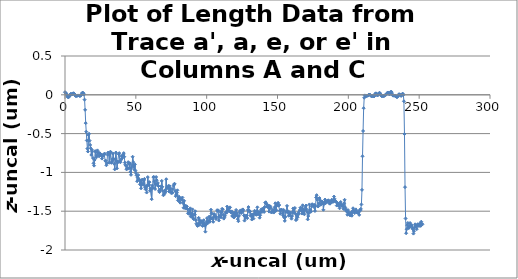
| Category | z-uncal    um |
|---|---|
| 0.0 | 0.034 |
| 0.394775 | 0.026 |
| 0.789549 | 0.017 |
| 1.18432 | 0.004 |
| 1.5791 | -0.015 |
| 1.97387 | -0.028 |
| 2.36865 | -0.033 |
| 2.76342 | -0.025 |
| 3.1582 | -0.017 |
| 3.55297 | -0.001 |
| 3.94775 | 0.01 |
| 4.34252 | 0.013 |
| 4.7373 | 0.005 |
| 5.13207 | 0.005 |
| 5.52685 | 0.013 |
| 5.92162 | 0.021 |
| 6.31639 | 0.017 |
| 6.71117 | 0.01 |
| 7.10594 | -0.008 |
| 7.50072 | -0.015 |
| 7.89549 | -0.015 |
| 8.29027 | -0.013 |
| 8.68504 | -0.013 |
| 9.07982 | -0.008 |
| 9.47459 | -0.009 |
| 9.86937 | -0.008 |
| 10.2641 | -0.014 |
| 10.6589 | -0.016 |
| 11.0537 | -0.01 |
| 11.4485 | -0.002 |
| 11.8432 | 0.011 |
| 12.238 | 0.027 |
| 12.6328 | 0.028 |
| 13.0276 | 0.016 |
| 13.4223 | 0.003 |
| 13.8171 | -0.062 |
| 14.2119 | -0.194 |
| 14.6067 | -0.365 |
| 15.0014 | -0.476 |
| 15.3962 | -0.588 |
| 15.791 | -0.693 |
| 16.1858 | -0.731 |
| 16.5805 | -0.517 |
| 16.9753 | -0.502 |
| 17.3701 | -0.59 |
| 17.7649 | -0.646 |
| 18.1596 | -0.689 |
| 18.5544 | -0.776 |
| 18.9492 | -0.709 |
| 19.344 | -0.731 |
| 19.7387 | -0.815 |
| 20.1335 | -0.883 |
| 20.5283 | -0.913 |
| 20.9231 | -0.839 |
| 21.3178 | -0.726 |
| 21.7126 | -0.734 |
| 22.1074 | -0.807 |
| 22.5022 | -0.786 |
| 22.8969 | -0.716 |
| 23.2917 | -0.762 |
| 23.6865 | -0.745 |
| 24.0813 | -0.792 |
| 24.476 | -0.751 |
| 24.8708 | -0.761 |
| 25.2656 | -0.783 |
| 25.6604 | -0.772 |
| 26.0551 | -0.822 |
| 26.4499 | -0.796 |
| 26.8447 | -0.778 |
| 27.2395 | -0.779 |
| 27.6342 | -0.764 |
| 28.029 | -0.758 |
| 28.4238 | -0.851 |
| 28.8185 | -0.849 |
| 29.2133 | -0.908 |
| 29.6081 | -0.88 |
| 30.0029 | -0.771 |
| 30.3976 | -0.744 |
| 30.7924 | -0.762 |
| 31.1872 | -0.875 |
| 31.582 | -0.765 |
| 31.9767 | -0.733 |
| 32.3715 | -0.741 |
| 32.7663 | -0.877 |
| 33.1611 | -0.861 |
| 33.5558 | -0.829 |
| 33.9506 | -0.758 |
| 34.3454 | -0.832 |
| 34.7402 | -0.889 |
| 35.1349 | -0.961 |
| 35.5297 | -0.826 |
| 35.9245 | -0.744 |
| 36.3193 | -0.853 |
| 36.714 | -0.948 |
| 37.1088 | -0.872 |
| 37.5036 | -0.862 |
| 37.8984 | -0.766 |
| 38.2931 | -0.752 |
| 38.6879 | -0.861 |
| 39.0827 | -0.87 |
| 39.4775 | -0.839 |
| 39.8722 | -0.792 |
| 40.267 | -0.82 |
| 40.6618 | -0.789 |
| 41.0566 | -0.771 |
| 41.4513 | -0.751 |
| 41.8461 | -0.798 |
| 42.2409 | -0.873 |
| 42.6357 | -0.9 |
| 43.0304 | -0.914 |
| 43.4252 | -0.96 |
| 43.82 | -0.944 |
| 44.2148 | -0.952 |
| 44.6095 | -0.868 |
| 45.0043 | -0.886 |
| 45.3991 | -0.944 |
| 45.7939 | -0.883 |
| 46.1886 | -0.994 |
| 46.5834 | -1.031 |
| 46.9782 | -0.939 |
| 47.373 | -0.904 |
| 47.7677 | -0.798 |
| 48.1625 | -0.868 |
| 48.5573 | -0.926 |
| 48.9521 | -0.963 |
| 49.3468 | -0.896 |
| 49.7416 | -0.978 |
| 50.1364 | -1.009 |
| 50.5312 | -1.038 |
| 50.9259 | -1.114 |
| 51.3207 | -1.067 |
| 51.7155 | -1.034 |
| 52.1103 | -1.092 |
| 52.505 | -1.1 |
| 52.8998 | -1.154 |
| 53.2946 | -1.102 |
| 53.6894 | -1.205 |
| 54.0841 | -1.102 |
| 54.4789 | -1.093 |
| 54.8737 | -1.158 |
| 55.2685 | -1.149 |
| 55.6632 | -1.101 |
| 56.058 | -1.083 |
| 56.4528 | -1.189 |
| 56.8475 | -1.218 |
| 57.2423 | -1.176 |
| 57.6371 | -1.26 |
| 58.0319 | -1.173 |
| 58.4266 | -1.06 |
| 58.8214 | -1.161 |
| 59.2162 | -1.157 |
| 59.611 | -1.125 |
| 60.0057 | -1.237 |
| 60.4005 | -1.209 |
| 60.7953 | -1.22 |
| 61.1901 | -1.346 |
| 61.5848 | -1.169 |
| 61.9796 | -1.198 |
| 62.3744 | -1.06 |
| 62.7692 | -1.06 |
| 63.1639 | -1.116 |
| 63.5587 | -1.214 |
| 63.9535 | -1.151 |
| 64.3483 | -1.059 |
| 64.743 | -1.1 |
| 65.1378 | -1.164 |
| 65.5326 | -1.136 |
| 65.9274 | -1.176 |
| 66.3221 | -1.238 |
| 66.7169 | -1.254 |
| 67.1117 | -1.235 |
| 67.5065 | -1.214 |
| 67.9012 | -1.181 |
| 68.296 | -1.11 |
| 68.6908 | -1.185 |
| 69.0856 | -1.24 |
| 69.4803 | -1.295 |
| 69.8751 | -1.281 |
| 70.2699 | -1.27 |
| 70.6647 | -1.232 |
| 71.0594 | -1.249 |
| 71.4542 | -1.088 |
| 71.849 | -1.205 |
| 72.2438 | -1.196 |
| 72.6385 | -1.2 |
| 73.0333 | -1.173 |
| 73.4281 | -1.246 |
| 73.8229 | -1.177 |
| 74.2176 | -1.241 |
| 74.6124 | -1.208 |
| 75.0072 | -1.267 |
| 75.402 | -1.255 |
| 75.7967 | -1.264 |
| 76.1915 | -1.214 |
| 76.5863 | -1.172 |
| 76.9811 | -1.153 |
| 77.3758 | -1.147 |
| 77.7706 | -1.239 |
| 78.1654 | -1.307 |
| 78.5602 | -1.289 |
| 78.9549 | -1.261 |
| 79.3497 | -1.231 |
| 79.7445 | -1.361 |
| 80.1393 | -1.333 |
| 80.534 | -1.313 |
| 80.9288 | -1.379 |
| 81.3236 | -1.391 |
| 81.7184 | -1.339 |
| 82.1131 | -1.342 |
| 82.5079 | -1.35 |
| 82.9027 | -1.323 |
| 83.2975 | -1.394 |
| 83.6922 | -1.456 |
| 84.087 | -1.366 |
| 84.4818 | -1.455 |
| 84.8766 | -1.461 |
| 85.2713 | -1.429 |
| 85.6661 | -1.463 |
| 86.0609 | -1.439 |
| 86.4556 | -1.472 |
| 86.8504 | -1.528 |
| 87.2452 | -1.522 |
| 87.64 | -1.536 |
| 88.0347 | -1.488 |
| 88.4295 | -1.463 |
| 88.8243 | -1.57 |
| 89.2191 | -1.531 |
| 89.6138 | -1.558 |
| 90.0086 | -1.476 |
| 90.4034 | -1.589 |
| 90.7982 | -1.602 |
| 91.1929 | -1.544 |
| 91.5877 | -1.542 |
| 91.9825 | -1.501 |
| 92.3773 | -1.617 |
| 92.772 | -1.66 |
| 93.1668 | -1.676 |
| 93.5616 | -1.69 |
| 93.9564 | -1.662 |
| 94.3511 | -1.586 |
| 94.7459 | -1.605 |
| 95.1407 | -1.676 |
| 95.5355 | -1.643 |
| 95.9302 | -1.634 |
| 96.325 | -1.628 |
| 96.7198 | -1.644 |
| 97.1146 | -1.69 |
| 97.5093 | -1.665 |
| 97.9041 | -1.616 |
| 98.2989 | -1.661 |
| 98.6937 | -1.685 |
| 99.0884 | -1.764 |
| 99.4832 | -1.674 |
| 99.878 | -1.637 |
| 100.273 | -1.589 |
| 100.668 | -1.657 |
| 101.062 | -1.638 |
| 101.457 | -1.629 |
| 101.852 | -1.569 |
| 102.247 | -1.636 |
| 102.641 | -1.587 |
| 103.036 | -1.481 |
| 103.431 | -1.526 |
| 103.826 | -1.596 |
| 104.221 | -1.589 |
| 104.615 | -1.637 |
| 105.01 | -1.539 |
| 105.405 | -1.538 |
| 105.8 | -1.573 |
| 106.194 | -1.568 |
| 106.589 | -1.601 |
| 106.984 | -1.582 |
| 107.379 | -1.487 |
| 107.773 | -1.497 |
| 108.168 | -1.489 |
| 108.563 | -1.62 |
| 108.958 | -1.57 |
| 109.353 | -1.563 |
| 109.747 | -1.508 |
| 110.142 | -1.579 |
| 110.537 | -1.51 |
| 110.932 | -1.469 |
| 111.326 | -1.477 |
| 111.721 | -1.551 |
| 112.116 | -1.596 |
| 112.511 | -1.578 |
| 112.906 | -1.559 |
| 113.3 | -1.526 |
| 113.695 | -1.51 |
| 114.09 | -1.519 |
| 114.485 | -1.44 |
| 114.879 | -1.472 |
| 115.274 | -1.49 |
| 115.669 | -1.497 |
| 116.064 | -1.457 |
| 116.459 | -1.45 |
| 116.853 | -1.509 |
| 117.248 | -1.517 |
| 117.643 | -1.502 |
| 118.038 | -1.56 |
| 118.432 | -1.567 |
| 118.827 | -1.526 |
| 119.222 | -1.581 |
| 119.617 | -1.518 |
| 120.011 | -1.562 |
| 120.406 | -1.552 |
| 120.801 | -1.483 |
| 121.196 | -1.521 |
| 121.591 | -1.558 |
| 121.985 | -1.602 |
| 122.38 | -1.629 |
| 122.775 | -1.56 |
| 123.17 | -1.518 |
| 123.564 | -1.498 |
| 123.959 | -1.49 |
| 124.354 | -1.525 |
| 124.749 | -1.51 |
| 125.144 | -1.483 |
| 125.538 | -1.477 |
| 125.933 | -1.49 |
| 126.328 | -1.555 |
| 126.723 | -1.621 |
| 127.117 | -1.567 |
| 127.512 | -1.589 |
| 127.907 | -1.556 |
| 128.302 | -1.558 |
| 128.697 | -1.59 |
| 129.091 | -1.484 |
| 129.486 | -1.447 |
| 129.881 | -1.488 |
| 130.276 | -1.508 |
| 130.67 | -1.504 |
| 131.065 | -1.56 |
| 131.46 | -1.542 |
| 131.855 | -1.607 |
| 132.25 | -1.572 |
| 132.644 | -1.542 |
| 133.039 | -1.596 |
| 133.434 | -1.538 |
| 133.829 | -1.494 |
| 134.223 | -1.514 |
| 134.618 | -1.534 |
| 135.013 | -1.546 |
| 135.408 | -1.496 |
| 135.802 | -1.45 |
| 136.197 | -1.54 |
| 136.592 | -1.531 |
| 136.987 | -1.508 |
| 137.382 | -1.584 |
| 137.776 | -1.552 |
| 138.171 | -1.508 |
| 138.566 | -1.478 |
| 138.961 | -1.512 |
| 139.355 | -1.467 |
| 139.75 | -1.49 |
| 140.145 | -1.469 |
| 140.54 | -1.51 |
| 140.935 | -1.446 |
| 141.329 | -1.391 |
| 141.724 | -1.385 |
| 142.119 | -1.405 |
| 142.514 | -1.439 |
| 142.908 | -1.42 |
| 143.303 | -1.45 |
| 143.698 | -1.442 |
| 144.093 | -1.505 |
| 144.488 | -1.431 |
| 144.882 | -1.44 |
| 145.277 | -1.46 |
| 145.672 | -1.516 |
| 146.067 | -1.509 |
| 146.461 | -1.499 |
| 146.856 | -1.481 |
| 147.251 | -1.518 |
| 147.646 | -1.511 |
| 148.04 | -1.448 |
| 148.435 | -1.397 |
| 148.83 | -1.494 |
| 149.225 | -1.489 |
| 149.62 | -1.426 |
| 150.014 | -1.407 |
| 150.409 | -1.391 |
| 150.804 | -1.428 |
| 151.199 | -1.42 |
| 151.593 | -1.492 |
| 151.988 | -1.533 |
| 152.383 | -1.482 |
| 152.778 | -1.483 |
| 153.173 | -1.484 |
| 153.567 | -1.526 |
| 153.962 | -1.556 |
| 154.357 | -1.484 |
| 154.752 | -1.581 |
| 155.146 | -1.625 |
| 155.541 | -1.573 |
| 155.936 | -1.512 |
| 156.331 | -1.503 |
| 156.726 | -1.431 |
| 157.12 | -1.512 |
| 157.515 | -1.502 |
| 157.91 | -1.559 |
| 158.305 | -1.537 |
| 158.699 | -1.513 |
| 159.094 | -1.525 |
| 159.489 | -1.564 |
| 159.884 | -1.597 |
| 160.279 | -1.563 |
| 160.673 | -1.505 |
| 161.068 | -1.464 |
| 161.463 | -1.522 |
| 161.858 | -1.467 |
| 162.252 | -1.458 |
| 162.647 | -1.531 |
| 163.042 | -1.615 |
| 163.437 | -1.605 |
| 163.831 | -1.548 |
| 164.226 | -1.577 |
| 164.621 | -1.528 |
| 165.016 | -1.537 |
| 165.411 | -1.502 |
| 165.805 | -1.484 |
| 166.2 | -1.455 |
| 166.595 | -1.457 |
| 166.99 | -1.491 |
| 167.384 | -1.531 |
| 167.779 | -1.424 |
| 168.174 | -1.528 |
| 168.569 | -1.479 |
| 168.964 | -1.541 |
| 169.358 | -1.483 |
| 169.753 | -1.444 |
| 170.148 | -1.427 |
| 170.543 | -1.476 |
| 170.937 | -1.51 |
| 171.332 | -1.606 |
| 171.727 | -1.562 |
| 172.122 | -1.527 |
| 172.517 | -1.413 |
| 172.911 | -1.486 |
| 173.306 | -1.486 |
| 173.701 | -1.505 |
| 174.096 | -1.436 |
| 174.49 | -1.41 |
| 174.885 | -1.419 |
| 175.28 | -1.424 |
| 175.675 | -1.445 |
| 176.069 | -1.419 |
| 176.464 | -1.497 |
| 176.859 | -1.428 |
| 177.254 | -1.322 |
| 177.649 | -1.293 |
| 178.043 | -1.352 |
| 178.438 | -1.44 |
| 178.833 | -1.436 |
| 179.228 | -1.399 |
| 179.622 | -1.331 |
| 180.017 | -1.358 |
| 180.412 | -1.416 |
| 180.807 | -1.406 |
| 181.202 | -1.379 |
| 181.596 | -1.376 |
| 181.991 | -1.397 |
| 182.386 | -1.482 |
| 182.781 | -1.408 |
| 183.175 | -1.388 |
| 183.57 | -1.35 |
| 183.965 | -1.397 |
| 184.36 | -1.373 |
| 184.755 | -1.377 |
| 185.149 | -1.377 |
| 185.544 | -1.366 |
| 185.939 | -1.359 |
| 186.334 | -1.374 |
| 186.728 | -1.402 |
| 187.123 | -1.403 |
| 187.518 | -1.377 |
| 187.913 | -1.383 |
| 188.308 | -1.352 |
| 188.702 | -1.368 |
| 189.097 | -1.381 |
| 189.492 | -1.373 |
| 189.887 | -1.311 |
| 190.281 | -1.341 |
| 190.676 | -1.373 |
| 191.071 | -1.373 |
| 191.466 | -1.383 |
| 191.86 | -1.428 |
| 192.255 | -1.393 |
| 192.65 | -1.404 |
| 193.045 | -1.42 |
| 193.44 | -1.428 |
| 193.834 | -1.463 |
| 194.229 | -1.404 |
| 194.624 | -1.381 |
| 195.019 | -1.423 |
| 195.413 | -1.432 |
| 195.808 | -1.433 |
| 196.203 | -1.42 |
| 196.598 | -1.47 |
| 196.993 | -1.398 |
| 197.387 | -1.353 |
| 197.782 | -1.451 |
| 198.177 | -1.491 |
| 198.572 | -1.481 |
| 198.966 | -1.506 |
| 199.361 | -1.546 |
| 199.756 | -1.485 |
| 200.151 | -1.513 |
| 200.546 | -1.539 |
| 200.94 | -1.535 |
| 201.335 | -1.555 |
| 201.73 | -1.531 |
| 202.125 | -1.517 |
| 202.519 | -1.558 |
| 202.914 | -1.501 |
| 203.309 | -1.462 |
| 203.704 | -1.494 |
| 204.098 | -1.501 |
| 204.493 | -1.524 |
| 204.888 | -1.506 |
| 205.283 | -1.476 |
| 205.678 | -1.498 |
| 206.072 | -1.515 |
| 206.467 | -1.516 |
| 206.862 | -1.523 |
| 207.257 | -1.514 |
| 207.651 | -1.548 |
| 208.046 | -1.486 |
| 208.441 | -1.491 |
| 208.836 | -1.471 |
| 209.231 | -1.413 |
| 209.625 | -1.225 |
| 210.02 | -0.793 |
| 210.415 | -0.466 |
| 210.81 | -0.173 |
| 211.204 | -0.038 |
| 211.599 | -0.007 |
| 211.994 | -0.015 |
| 212.389 | -0.018 |
| 212.784 | -0.015 |
| 213.178 | -0.012 |
| 213.573 | -0.013 |
| 213.968 | -0.008 |
| 214.363 | -0.001 |
| 214.757 | 0.003 |
| 215.152 | 0.003 |
| 215.547 | -0.004 |
| 215.942 | -0.01 |
| 216.337 | -0.02 |
| 216.731 | -0.019 |
| 217.126 | -0.011 |
| 217.521 | -0.012 |
| 217.916 | -0.022 |
| 218.31 | -0.019 |
| 218.705 | -0.003 |
| 219.1 | 0.017 |
| 219.495 | 0.019 |
| 219.889 | 0.01 |
| 220.284 | -0.004 |
| 220.679 | -0.009 |
| 221.074 | 0.002 |
| 221.469 | 0.017 |
| 221.863 | 0.024 |
| 222.258 | 0.022 |
| 222.653 | 0.009 |
| 223.048 | -0.006 |
| 223.442 | -0.016 |
| 223.837 | -0.016 |
| 224.232 | -0.015 |
| 224.627 | -0.013 |
| 225.022 | -0.017 |
| 225.416 | -0.013 |
| 225.811 | -0.006 |
| 226.206 | 0 |
| 226.601 | 0.002 |
| 226.995 | 0.007 |
| 227.39 | 0.019 |
| 227.785 | 0.03 |
| 228.18 | 0.03 |
| 228.575 | 0.015 |
| 228.969 | 0.005 |
| 229.364 | 0.012 |
| 229.759 | 0.032 |
| 230.154 | 0.041 |
| 230.548 | 0.033 |
| 230.943 | 0.009 |
| 231.338 | -0.008 |
| 231.733 | -0.011 |
| 232.127 | -0.01 |
| 232.522 | -0.01 |
| 232.917 | -0.012 |
| 233.312 | -0.017 |
| 233.707 | -0.022 |
| 234.101 | -0.028 |
| 234.496 | -0.03 |
| 234.891 | -0.021 |
| 235.286 | -0.005 |
| 235.68 | 0.006 |
| 236.075 | 0.007 |
| 236.47 | 0.002 |
| 236.865 | -0.008 |
| 237.26 | -0.015 |
| 237.654 | -0.006 |
| 238.049 | 0.009 |
| 238.444 | 0.015 |
| 238.839 | -0.001 |
| 239.233 | -0.084 |
| 239.628 | -0.504 |
| 240.023 | -1.19 |
| 240.418 | -1.594 |
| 240.813 | -1.784 |
| 241.207 | -1.733 |
| 241.602 | -1.68 |
| 241.997 | -1.651 |
| 242.392 | -1.714 |
| 242.786 | -1.716 |
| 243.181 | -1.702 |
| 243.576 | -1.652 |
| 243.971 | -1.68 |
| 244.366 | -1.687 |
| 244.76 | -1.679 |
| 245.155 | -1.714 |
| 245.55 | -1.732 |
| 245.945 | -1.789 |
| 246.339 | -1.757 |
| 246.734 | -1.708 |
| 247.129 | -1.669 |
| 247.524 | -1.692 |
| 247.918 | -1.7 |
| 248.313 | -1.731 |
| 248.708 | -1.676 |
| 249.103 | -1.667 |
| 249.498 | -1.677 |
| 249.892 | -1.691 |
| 250.287 | -1.685 |
| 250.682 | -1.659 |
| 251.077 | -1.689 |
| 251.471 | -1.635 |
| 251.866 | -1.662 |
| 252.261 | -1.67 |